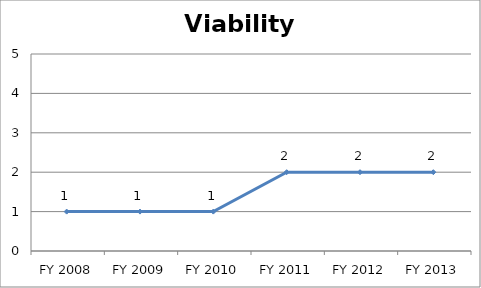
| Category | Viability score |
|---|---|
| FY 2013 | 2 |
| FY 2012 | 2 |
| FY 2011 | 2 |
| FY 2010 | 1 |
| FY 2009 | 1 |
| FY 2008 | 1 |